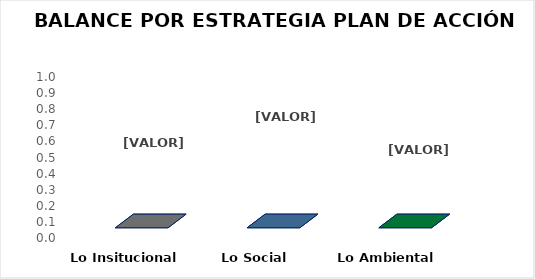
| Category | Series 0 |
|---|---|
| Lo Insitucional | 0 |
| Lo Social  | 0 |
| Lo Ambiental  | 0 |